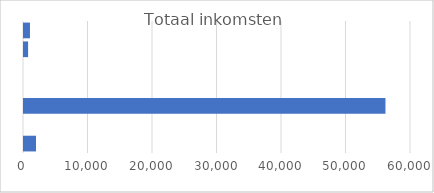
| Category | Totaal inkomsten |
|---|---|
| Belasting | 925 |
| Declaraties | 635 |
| Kostgeld | 0 |
| Overige inkomsten | 0 |
| Salaris | 56040 |
| Spaarpot | 0 |
| Toeslagen | 1860 |